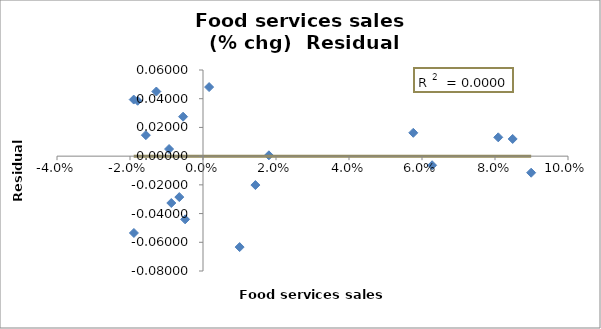
| Category | Series 0 |
|---|---|
| -0.008688844068863943 | -0.033 |
| 0.08990780007897947 | -0.012 |
| 0.0016777069762679009 | 0.048 |
| -0.01565596200421482 | 0.015 |
| 0.01004145996596928 | -0.063 |
| 0.0627738496338126 | -0.006 |
| -0.012785116279069753 | 0.045 |
| -0.009294647097401576 | 0.005 |
| -0.004900170440711005 | -0.044 |
| 0.057608196972014136 | 0.016 |
| -0.017908526974854344 | 0.039 |
| 0.014355440712029877 | -0.02 |
| -0.018927765318934253 | -0.054 |
| 0.08484305994274255 | 0.012 |
| -0.005462058807484627 | 0.027 |
| 0.01805316530336576 | 0.001 |
| -0.006492456896551757 | -0.029 |
| 0.08089292009002413 | 0.013 |
| -0.018977854988115328 | 0.039 |